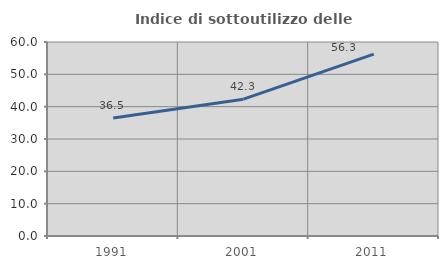
| Category | Indice di sottoutilizzo delle abitazioni  |
|---|---|
| 1991.0 | 36.469 |
| 2001.0 | 42.317 |
| 2011.0 | 56.257 |